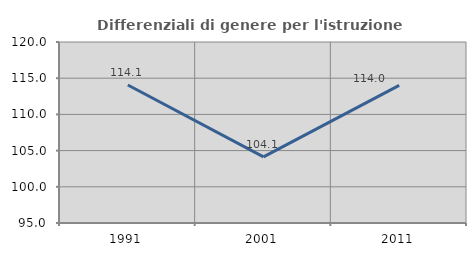
| Category | Differenziali di genere per l'istruzione superiore |
|---|---|
| 1991.0 | 114.063 |
| 2001.0 | 104.131 |
| 2011.0 | 114.017 |